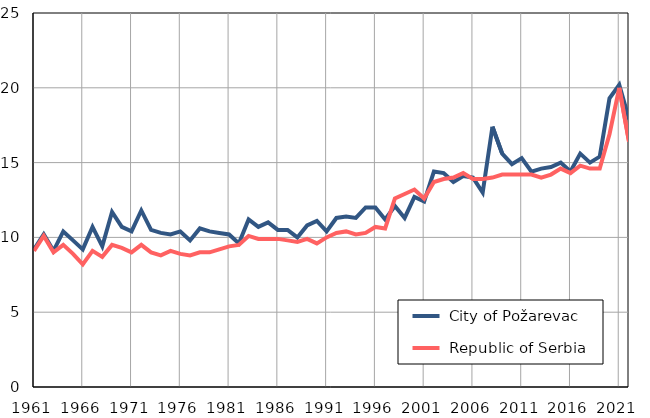
| Category |  City of Požarevac |  Republic of Serbia |
|---|---|---|
| 1961.0 | 9.2 | 9.1 |
| 1962.0 | 10.2 | 10.1 |
| 1963.0 | 9.1 | 9 |
| 1964.0 | 10.4 | 9.5 |
| 1965.0 | 9.8 | 8.9 |
| 1966.0 | 9.2 | 8.2 |
| 1967.0 | 10.7 | 9.1 |
| 1968.0 | 9.4 | 8.7 |
| 1969.0 | 11.7 | 9.5 |
| 1970.0 | 10.7 | 9.3 |
| 1971.0 | 10.4 | 9 |
| 1972.0 | 11.8 | 9.5 |
| 1973.0 | 10.5 | 9 |
| 1974.0 | 10.3 | 8.8 |
| 1975.0 | 10.2 | 9.1 |
| 1976.0 | 10.4 | 8.9 |
| 1977.0 | 9.8 | 8.8 |
| 1978.0 | 10.6 | 9 |
| 1979.0 | 10.4 | 9 |
| 1980.0 | 10.3 | 9.2 |
| 1981.0 | 10.2 | 9.4 |
| 1982.0 | 9.6 | 9.5 |
| 1983.0 | 11.2 | 10.1 |
| 1984.0 | 10.7 | 9.9 |
| 1985.0 | 11 | 9.9 |
| 1986.0 | 10.5 | 9.9 |
| 1987.0 | 10.5 | 9.8 |
| 1988.0 | 10 | 9.7 |
| 1989.0 | 10.8 | 9.9 |
| 1990.0 | 11.1 | 9.6 |
| 1991.0 | 10.4 | 10 |
| 1992.0 | 11.3 | 10.3 |
| 1993.0 | 11.4 | 10.4 |
| 1994.0 | 11.3 | 10.2 |
| 1995.0 | 12 | 10.3 |
| 1996.0 | 12 | 10.7 |
| 1997.0 | 11.2 | 10.6 |
| 1998.0 | 12.1 | 12.6 |
| 1999.0 | 11.3 | 12.9 |
| 2000.0 | 12.7 | 13.2 |
| 2001.0 | 12.4 | 12.6 |
| 2002.0 | 14.4 | 13.7 |
| 2003.0 | 14.3 | 13.9 |
| 2004.0 | 13.7 | 14 |
| 2005.0 | 14.1 | 14.3 |
| 2006.0 | 14 | 13.9 |
| 2007.0 | 13 | 13.9 |
| 2008.0 | 17.4 | 14 |
| 2009.0 | 15.6 | 14.2 |
| 2010.0 | 14.9 | 14.2 |
| 2011.0 | 15.3 | 14.2 |
| 2012.0 | 14.4 | 14.2 |
| 2013.0 | 14.6 | 14 |
| 2014.0 | 14.7 | 14.2 |
| 2015.0 | 15 | 14.6 |
| 2016.0 | 14.4 | 14.3 |
| 2017.0 | 15.6 | 14.8 |
| 2018.0 | 15 | 14.6 |
| 2019.0 | 15.4 | 14.6 |
| 2020.0 | 19.3 | 16.9 |
| 2021.0 | 20.2 | 20 |
| 2022.0 | 17.9 | 16.4 |